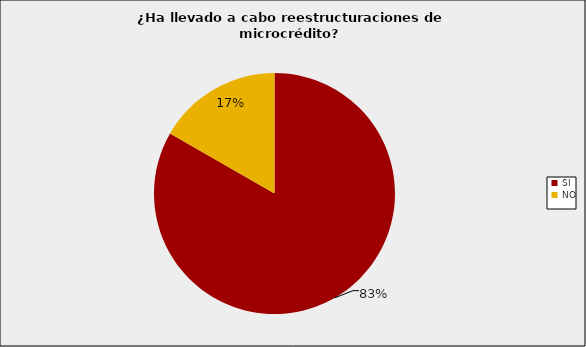
| Category | Entidades Supervisadas SFC |
|---|---|
| SI | 0.833 |
| NO | 0.167 |